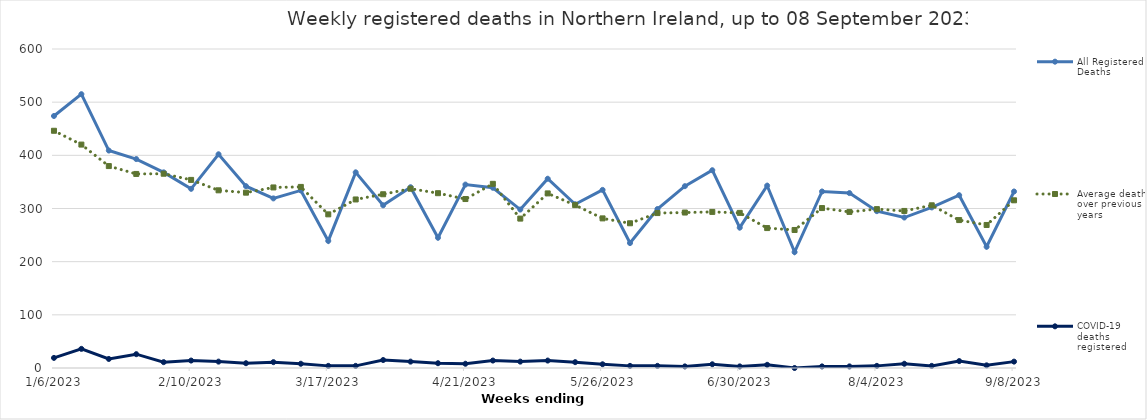
| Category | All Registered Deaths | Average deaths over previous 5 years | COVID-19 deaths registered |
|---|---|---|---|
| 1/6/23 | 474 | 446.2 | 19 |
| 1/13/23 | 515 | 420.2 | 36 |
| 1/20/23 | 409 | 379.8 | 17 |
| 1/27/23 | 393 | 365 | 26 |
| 2/3/23 | 368 | 365.4 | 11 |
| 2/10/23 | 337 | 353.8 | 14 |
| 2/17/23 | 402 | 334.2 | 12 |
| 2/24/23 | 342 | 329.8 | 9 |
| 3/3/23 | 319 | 339.6 | 11 |
| 3/10/23 | 334 | 340.6 | 8 |
| 3/17/23 | 239 | 289 | 4 |
| 3/24/23 | 368 | 317 | 4 |
| 3/31/23 | 306 | 326.8 | 15 |
| 4/7/23 | 340 | 337.2 | 12 |
| 4/14/23 | 245 | 328.8 | 9 |
| 4/21/23 | 345 | 317.8 | 8 |
| 4/28/23 | 339 | 346.4 | 14 |
| 5/5/23 | 298 | 281 | 12 |
| 5/12/23 | 356 | 328.4 | 14 |
| 5/19/23 | 308 | 306.4 | 11 |
| 5/26/23 | 335 | 281.4 | 7 |
| 6/2/23 | 235 | 272.2 | 4 |
| 6/9/23 | 299 | 291.4 | 4 |
| 6/16/23 | 342 | 292.4 | 3 |
| 6/23/23 | 372 | 293.6 | 7 |
| 6/30/23 | 264 | 291.8 | 3 |
| 7/7/23 | 343 | 263.2 | 6 |
| 7/14/23 | 218 | 259.6 | 0 |
| 7/21/23 | 332 | 300.8 | 3 |
| 7/28/23 | 329 | 293.6 | 3 |
| 8/4/23 | 295 | 298.8 | 4 |
| 8/11/23 | 283 | 295.4 | 8 |
| 8/18/23 | 302 | 306 | 4 |
| 8/25/23 | 325 | 278.2 | 13 |
| 9/1/23 | 228 | 269 | 5 |
| 9/8/23 | 332 | 315.4 | 12 |